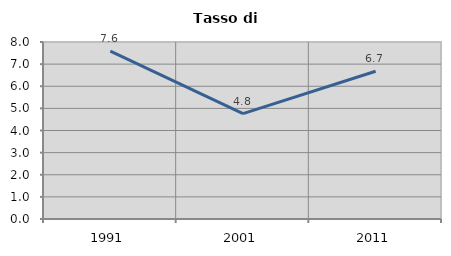
| Category | Tasso di disoccupazione   |
|---|---|
| 1991.0 | 7.59 |
| 2001.0 | 4.762 |
| 2011.0 | 6.679 |